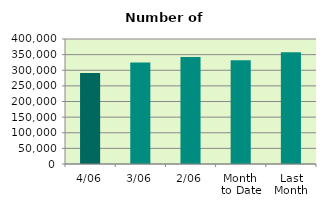
| Category | Series 0 |
|---|---|
| 4/06 | 291166 |
| 3/06 | 324834 |
| 2/06 | 342194 |
| Month 
to Date | 331676.5 |
| Last
Month | 357760.286 |